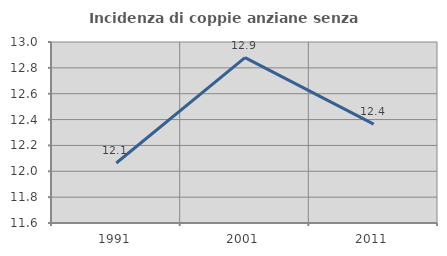
| Category | Incidenza di coppie anziane senza figli  |
|---|---|
| 1991.0 | 12.064 |
| 2001.0 | 12.879 |
| 2011.0 | 12.364 |